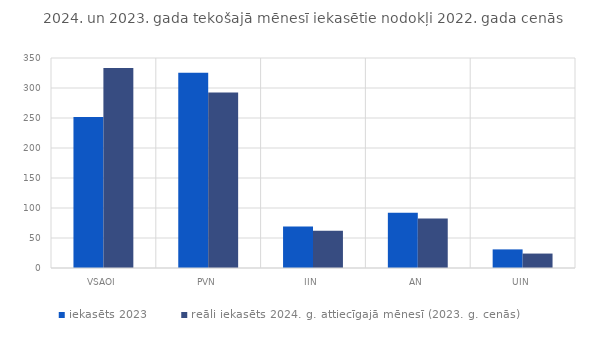
| Category | iekasēts 2023 | reāli iekasēts 2024. g. attiecīgajā mēnesī (2023. g. cenās) |
|---|---|---|
| VSAOI | 251.649 | 333.222 |
| PVN | 325.432 | 292.351 |
| IIN | 69.21 | 61.927 |
| AN | 92.239 | 82.518 |
| UIN | 31.008 | 24.061 |